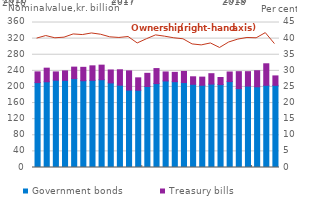
| Category | Government bonds | Treasury bills |
|---|---|---|
| 2016-01-01 | 210.7 | 26.7 |
| 2016-02-01 | 212.8 | 33.8 |
| 2016-03-01 | 216.8 | 20.5 |
| 2016-04-01 | 216.4 | 23.5 |
| 2016-05-01 | 220.7 | 28.5 |
| 2016-06-01 | 215.5 | 33.2 |
| 2016-07-01 | 216.4 | 36 |
| 2016-08-01 | 217.9 | 36.2 |
| 2016-09-01 | 210 | 32.1 |
| 2016-10-01 | 204.4 | 38.2 |
| 2016-11-01 | 192.2 | 47.7 |
| 2016-12-01 | 191.8 | 30.8 |
| 2017-01-01 | 201.1 | 32.7 |
| 2017-02-01 | 208.3 | 37.3 |
| 2017-03-01 | 214.9 | 22.3 |
| 2017-04-01 | 213 | 23.2 |
| 2017-05-01 | 210.9 | 27.6 |
| 2017-06-01 | 206.6 | 18.6 |
| 2017-07-01 | 204.2 | 20.2 |
| 2017-08-01 | 207.1 | 25.8 |
| 2017-09-01 | 205.9 | 17.6 |
| 2017-10-01 | 213.3 | 23.8 |
| 2017-11-01 | 195.8 | 42.1 |
| 2017-12-01 | 202.1 | 35.8 |
| 2018-01-01 | 200.4 | 39.9 |
| 2018-02-01 | 204.1 | 53.4 |
| 2018-03-01 | 204 | 23.4 |